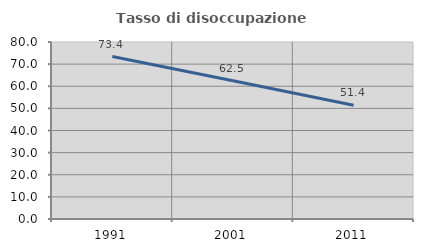
| Category | Tasso di disoccupazione giovanile  |
|---|---|
| 1991.0 | 73.438 |
| 2001.0 | 62.5 |
| 2011.0 | 51.429 |